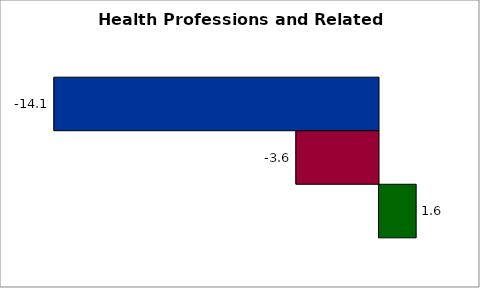
| Category | 50 states and D.C. | SREB states | State |
|---|---|---|---|
| 0 | -14.114 | -3.593 | 1.616 |